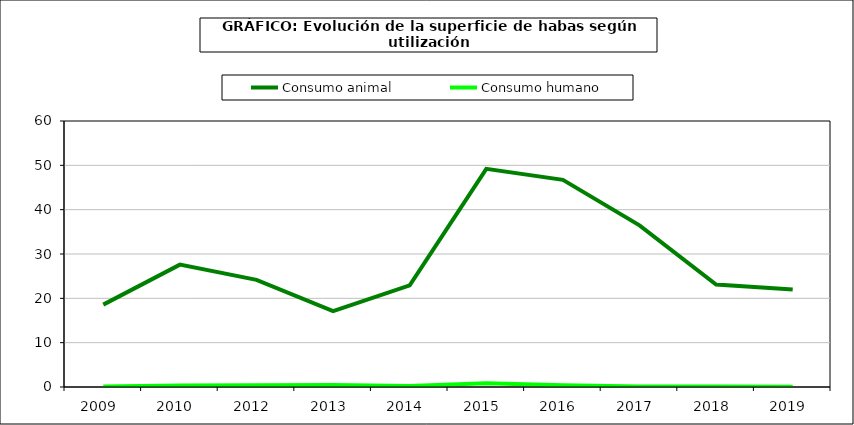
| Category | Consumo animal | Consumo humano |
|---|---|---|
| 2009  | 18.586 | 0.118 |
| 2010  | 27.596 | 0.361 |
| 2012  | 24.156 | 0.408 |
| 2013  | 17.1 | 0.442 |
| 2014  | 22.918 | 0.247 |
| 2015  | 49.204 | 0.868 |
| 2016  | 46.723 | 0.386 |
| 2017  | 36.47 | 0.104 |
| 2018  | 23.126 | 0.108 |
| 2019  | 21.994 | 0.071 |